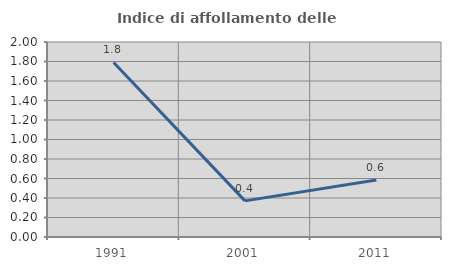
| Category | Indice di affollamento delle abitazioni  |
|---|---|
| 1991.0 | 1.79 |
| 2001.0 | 0.37 |
| 2011.0 | 0.585 |